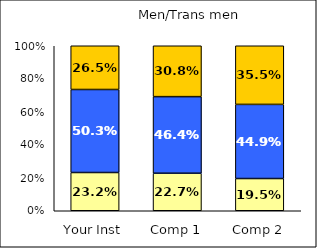
| Category | Low Habits of Mind | Average Habits of Mind | High Habits of Mind |
|---|---|---|---|
| Your Inst | 0.232 | 0.503 | 0.265 |
| Comp 1 | 0.227 | 0.464 | 0.308 |
| Comp 2 | 0.195 | 0.449 | 0.355 |